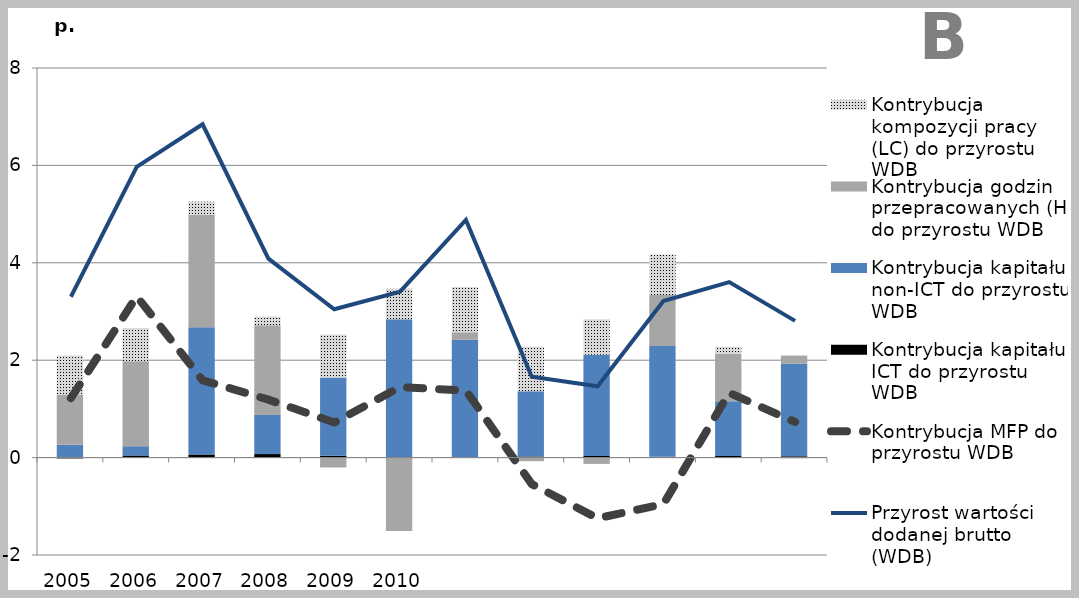
| Category | Kontrybucja kapitału ICT do przyrostu WDB | Kontrybucja kapitału non-ICT do przyrostu WDB | Kontrybucja godzin przepracowanych (H) do przyrostu WDB | Kontrybucja kompozycji pracy (LC) do przyrostu WDB |
|---|---|---|---|---|
| 2005.0 | -0.017 | 0.263 | 1.025 | 0.81 |
| 2006.0 | 0.043 | 0.191 | 1.746 | 0.679 |
| 2007.0 | 0.064 | 2.612 | 2.308 | 0.272 |
| 2008.0 | 0.072 | 0.803 | 1.845 | 0.174 |
| 2009.0 | 0.037 | 1.61 | -0.203 | 0.881 |
| 2010.0 | -0.007 | 2.84 | -1.5 | 0.626 |